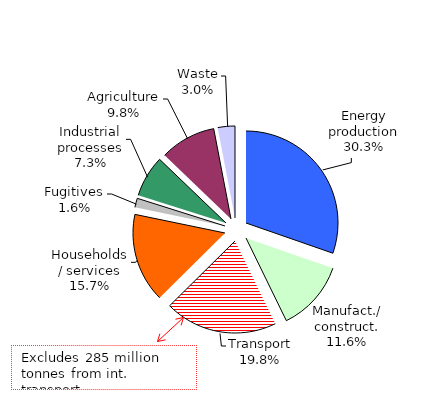
| Category | Series 0 |
|---|---|
| Energy production | 1425346.386 |
| Manufact. / construction | 584883.737 |
| Transport | 930725.221 |
| Households / services | 736379.194 |
| Fugitives | 76143.075 |
| Industrial processes | 343130.404 |
| Agriculture | 461566.781 |
| Waste | 141506.775 |